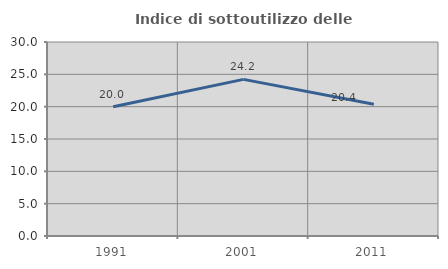
| Category | Indice di sottoutilizzo delle abitazioni  |
|---|---|
| 1991.0 | 20 |
| 2001.0 | 24.224 |
| 2011.0 | 20.382 |